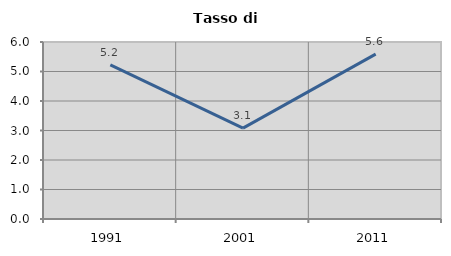
| Category | Tasso di disoccupazione   |
|---|---|
| 1991.0 | 5.222 |
| 2001.0 | 3.082 |
| 2011.0 | 5.59 |